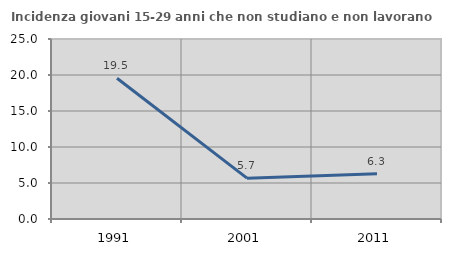
| Category | Incidenza giovani 15-29 anni che non studiano e non lavorano  |
|---|---|
| 1991.0 | 19.549 |
| 2001.0 | 5.675 |
| 2011.0 | 6.287 |